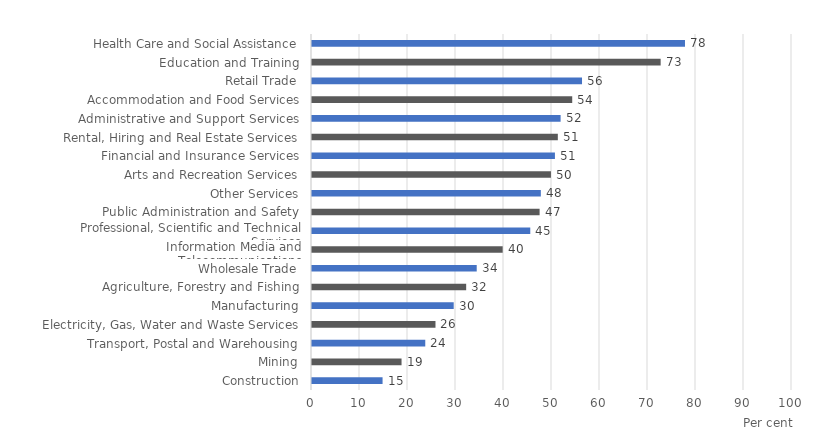
| Category | Series 0 |
|---|---|
| Construction | 14.702 |
| Mining | 18.655 |
| Transport, Postal and Warehousing | 23.597 |
| Electricity, Gas, Water and Waste Services | 25.726 |
| Manufacturing | 29.523 |
| Agriculture, Forestry and Fishing | 32.12 |
| Wholesale Trade | 34.317 |
| Information Media and Telecommunications | 39.726 |
| Professional, Scientific and Technical Services | 45.473 |
| Public Administration and Safety | 47.418 |
| Other Services | 47.673 |
| Arts and Recreation Services | 49.781 |
| Financial and Insurance Services | 50.611 |
| Rental, Hiring and Real Estate Services | 51.214 |
| Administrative and Support Services | 51.793 |
| Accommodation and Food Services | 54.213 |
| Retail Trade | 56.253 |
| Education and Training | 72.638 |
| Health Care and Social Assistance | 77.706 |